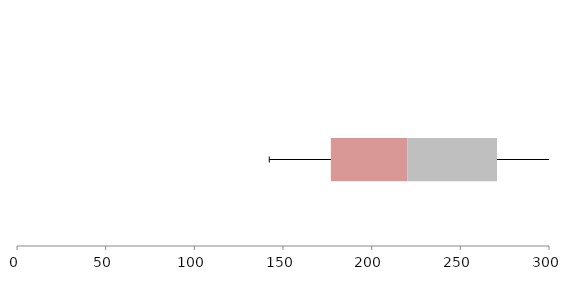
| Category | Series 1 | Series 2 | Series 3 |
|---|---|---|---|
| 0 | 176.984 | 43.106 | 50.59 |